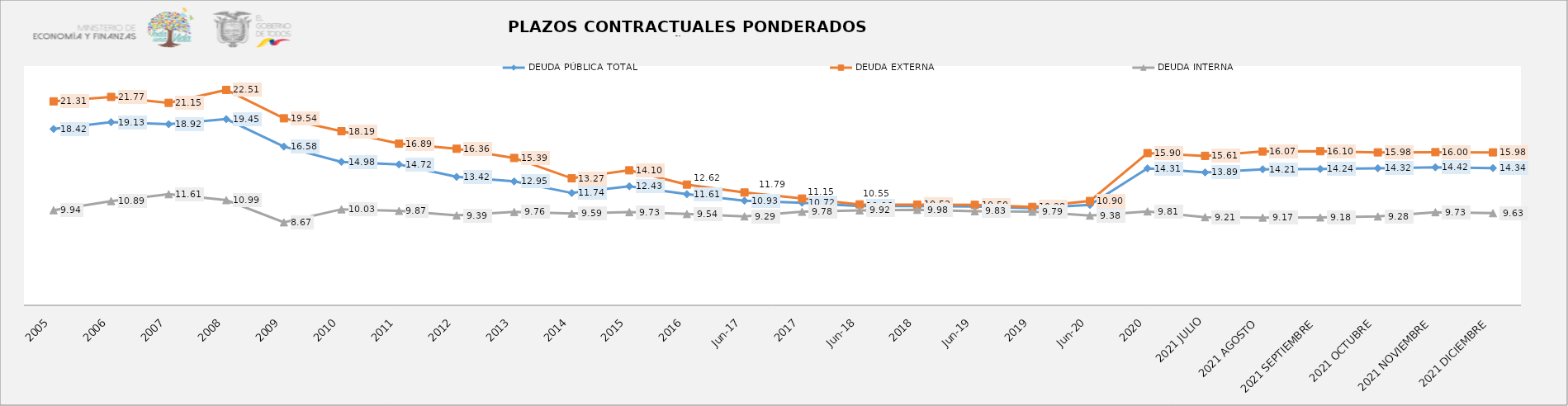
| Category | DEUDA PÚBLICA TOTAL | DEUDA EXTERNA  | DEUDA INTERNA |
|---|---|---|---|
| 2005 | 18.42 | 21.31 | 9.94 |
| 2006 | 19.13 | 21.77 | 10.89 |
| 2007 | 18.92 | 21.15 | 11.61 |
| 2008 | 19.45 | 22.505 | 10.99 |
| 2009 | 16.58 | 19.536 | 8.67 |
| 2010 | 14.98 | 18.188 | 10.03 |
| 2011 | 14.717 | 16.89 | 9.87 |
| 2012 | 13.423 | 16.356 | 9.39 |
| 2013 | 12.946 | 15.393 | 9.76 |
| 2014 | 11.737 | 13.27 | 9.59 |
| 2015 | 12.43 | 14.105 | 9.734 |
| 2016 | 11.611 | 12.616 | 9.541 |
| jun-17 | 10.928 | 11.786 | 9.294 |
| 2017 | 10.717 | 11.155 | 9.776 |
| jun-18 | 10.364 | 10.547 | 9.919 |
| 2018 | 10.371 | 10.522 | 9.976 |
| jun-19 | 10.321 | 10.498 | 9.835 |
| 2019 | 10.156 | 10.284 | 9.786 |
| jun-20 | 10.488 | 10.898 | 9.379 |
| 2020 | 14.309 | 15.905 | 9.812 |
| 2021 JULIO | 13.89 | 15.614 | 9.21 |
| 2021 AGOSTO | 14.21 | 16.07 | 9.17 |
| 2021 SEPTIEMBRE | 14.24 | 16.1 | 9.18 |
| 2021 OCTUBRE | 14.32 | 15.98 | 9.28 |
| 2021 NOVIEMBRE | 14.42 | 16 | 9.73 |
| 2021 DICIEMBRE | 14.34 | 15.98 | 9.63 |